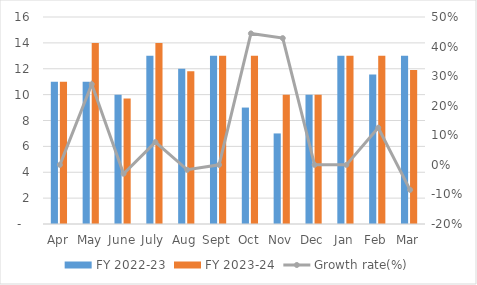
| Category | FY 2022-23 | FY 2023-24 |
|---|---|---|
| Apr | 11 | 11 |
| May | 11 | 14 |
| June | 10 | 9.7 |
| July | 13 | 14 |
| Aug | 12 | 11.8 |
| Sept | 13 | 13 |
| Oct | 9 | 13 |
| Nov | 7 | 10 |
| Dec | 10 | 10 |
| Jan | 13 | 13 |
| Feb | 11.55 | 13 |
| Mar | 13 | 11.9 |